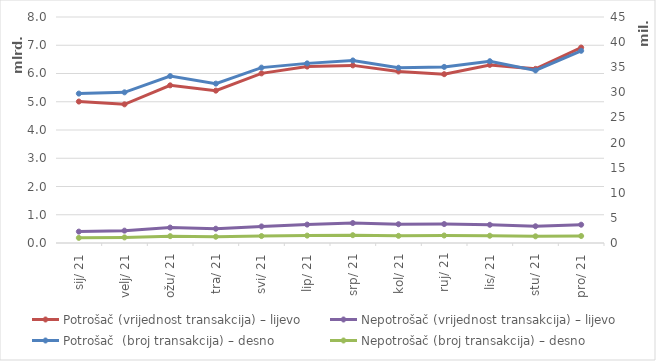
| Category | Potrošač (vrijednost transakcija) – lijevo | Nepotrošač (vrijednost transakcija) – lijevo |
|---|---|---|
| 2021-01-01 | 5007307123 | 403211930 |
| 2021-02-01 | 4908657459 | 437220207 |
| 2021-03-01 | 5580896543 | 546464861 |
| 2021-04-01 | 5393152894 | 505535417 |
| 2021-05-01 | 6004165849 | 586561281 |
| 2021-06-01 | 6244910718 | 652174677 |
| 2021-07-01 | 6287373723 | 706676918 |
| 2021-08-01 | 6071682571 | 665078746 |
| 2021-09-01 | 5975715061 | 670544755 |
| 2021-10-01 | 6304206953 | 644139655 |
| 2021-11-01 | 6164338184 | 592570006 |
| 2021-12-01 | 6919193507 | 647732038 |